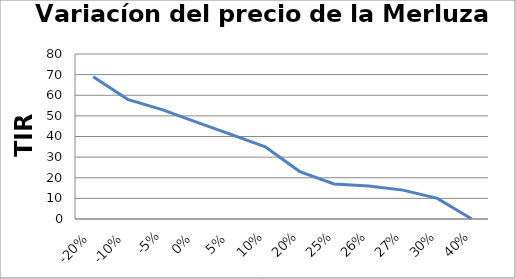
| Category | Series 0 |
|---|---|
| -0.2 | 69 |
| -0.1 | 58 |
| -0.05 | 53 |
| 0.0 | 47 |
| 0.05 | 41 |
| 0.1 | 35 |
| 0.2 | 23 |
| 0.25 | 17 |
| 0.26 | 16 |
| 0.27 | 14 |
| 0.3 | 10 |
| 0.4 | 0 |